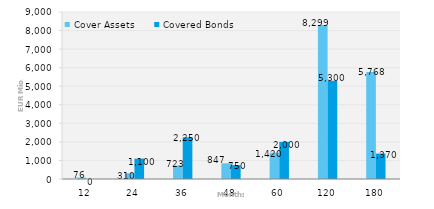
| Category | Cover Assets | Covered Bonds |
|---|---|---|
| 12.0 | 76.488 | 0 |
| 24.0 | 309.705 | 1100 |
| 36.0 | 723.198 | 2250 |
| 48.0 | 846.943 | 750 |
| 60.0 | 1419.564 | 2000 |
| 120.0 | 8298.562 | 5300 |
| 180.0 | 5768.39 | 1370 |